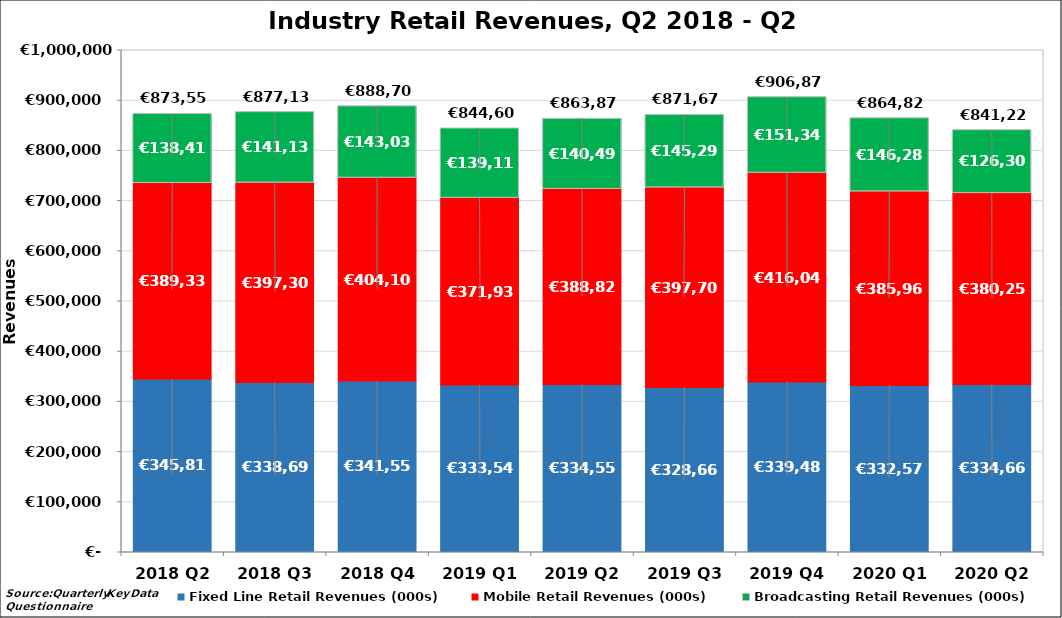
| Category | Fixed Line Retail Revenues (000s) | Mobile Retail Revenues (000s) | Broadcasting Retail Revenues (000s) |
|---|---|---|---|
| 2018 Q2 | 345809.869 | 389336.302 | 138411.956 |
| 2018 Q3 | 338692.364 | 397308.293 | 141136.874 |
| 2018 Q4 | 341555.412 | 404108.118 | 143038.444 |
| 2019 Q1 | 333546.469 | 371937.702 | 139116.768 |
| 2019 Q2 | 334555.661 | 388825.881 | 140493.699 |
| 2019 Q3 | 328666.506 | 397708.31 | 145297.666 |
| 2019 Q4 | 339487.178 | 416043.983 | 151346.492 |
| 2020 Q1 | 332576.335 | 385960.264 | 146283 |
| 2020 Q2 | 334667.08 | 380254.471 | 126307 |